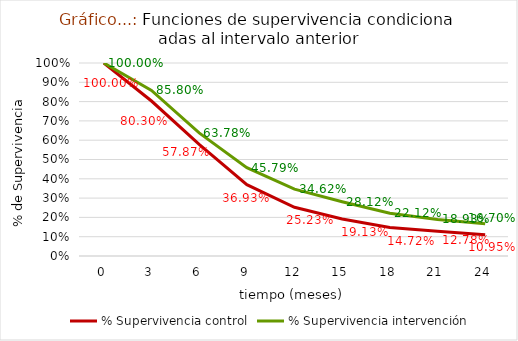
| Category | % Supervivencia control | % Supervivencia intervención |
|---|---|---|
| 0.0 | 1 | 1 |
| 3.0 | 0.803 | 0.858 |
| 6.0 | 0.579 | 0.638 |
| 9.0 | 0.369 | 0.458 |
| 12.0 | 0.252 | 0.346 |
| 15.0 | 0.191 | 0.281 |
| 18.0 | 0.147 | 0.221 |
| 21.0 | 0.128 | 0.189 |
| 24.0 | 0.11 | 0.167 |